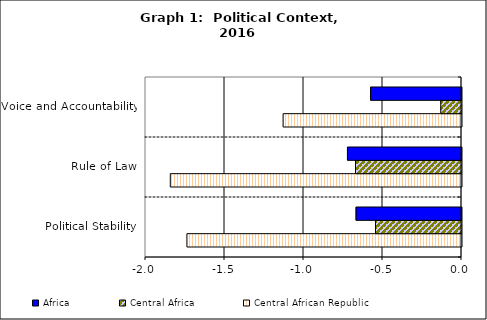
| Category | Central African Republic | Central Africa | Africa |
|---|---|---|---|
| Political Stability | -1.738 | -0.544 | -0.667 |
| Rule of Law | -1.843 | -0.671 | -0.722 |
| Voice and Accountability | -1.129 | -0.131 | -0.576 |